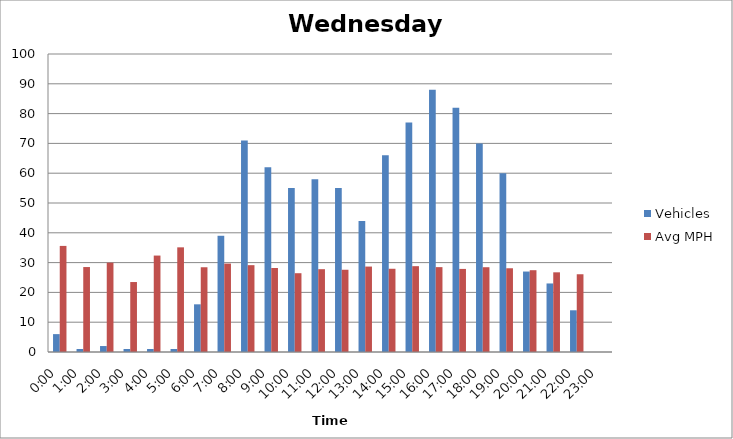
| Category | Vehicles | Avg MPH |
|---|---|---|
| 0:00 | 6 | 35.6 |
| 1:00 | 1 | 28.51 |
| 2:00 | 2 | 29.98 |
| 3:00 | 1 | 23.48 |
| 4:00 | 1 | 32.36 |
| 5:00 | 1 | 35.12 |
| 6:00 | 16 | 28.44 |
| 7:00 | 39 | 29.67 |
| 8:00 | 71 | 29.14 |
| 9:00 | 62 | 28.19 |
| 10:00 | 55 | 26.44 |
| 11:00 | 58 | 27.79 |
| 12:00 | 55 | 27.6 |
| 13:00 | 44 | 28.67 |
| 14:00 | 66 | 27.93 |
| 15:00 | 77 | 28.8 |
| 16:00 | 88 | 28.48 |
| 17:00 | 82 | 27.88 |
| 18:00 | 70 | 28.45 |
| 19:00 | 60 | 28.1 |
| 20:00 | 27 | 27.45 |
| 21:00 | 23 | 26.74 |
| 22:00 | 14 | 26.09 |
| 23:00 | 0 | 0 |